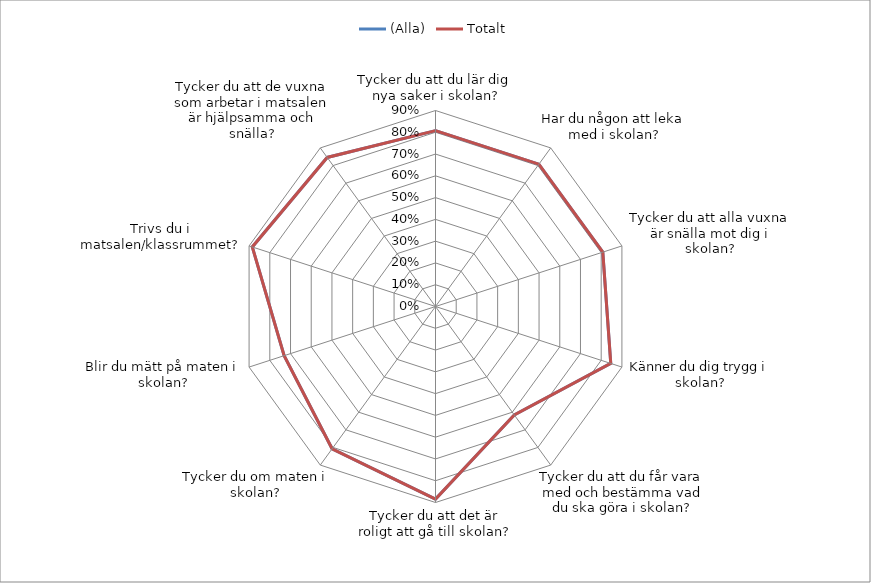
| Category | (Alla) | Totalt |
|---|---|---|
| Tycker du att du lär dig nya saker i skolan? | 0.808 | 0.808 |
| Har du någon att leka med i skolan? | 0.808 | 0.808 |
| Tycker du att alla vuxna är snälla mot dig i skolan? | 0.808 | 0.808 |
| Känner du dig trygg i skolan? | 0.846 | 0.846 |
| Tycker du att du får vara med och bestämma vad du ska göra i skolan? | 0.615 | 0.615 |
| Tycker du att det är roligt att gå till skolan? | 0.885 | 0.885 |
| Tycker du om maten i skolan? | 0.808 | 0.808 |
| Blir du mätt på maten i skolan? | 0.731 | 0.731 |
| Trivs du i matsalen/klassrummet? | 0.885 | 0.885 |
| Tycker du att de vuxna som arbetar i matsalen är hjälpsamma och snälla? | 0.846 | 0.846 |